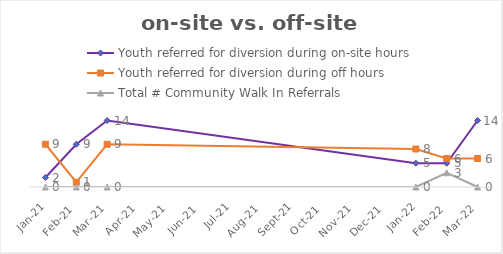
| Category | Youth referred for diversion during on-site hours | Youth referred for diversion during off hours | Total # Community Walk In Referrals |
|---|---|---|---|
| 2021-01-01 | 2 | 9 | 0 |
| 2021-02-01 | 9 | 1 | 0 |
| 2021-03-01 | 14 | 9 | 0 |
| 2022-01-01 | 5 | 8 | 0 |
| 2022-02-01 | 5 | 6 | 3 |
| 2022-03-01 | 14 | 6 | 0 |